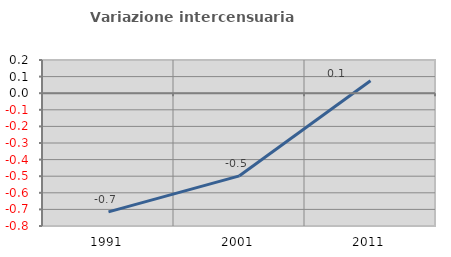
| Category | Variazione intercensuaria annua |
|---|---|
| 1991.0 | -0.715 |
| 2001.0 | -0.498 |
| 2011.0 | 0.075 |